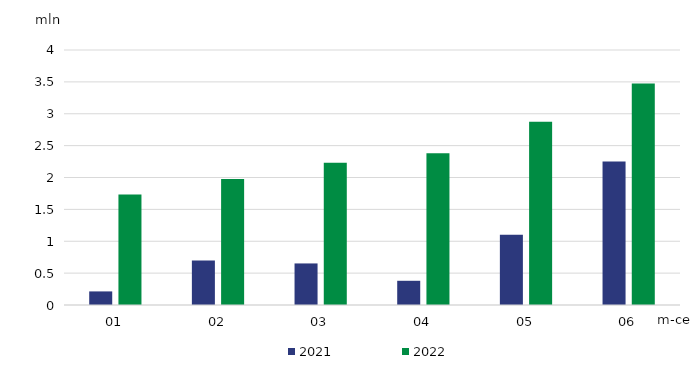
| Category | 2021 | 2022 |
|---|---|---|
| 01 | 0.213 | 1.734 |
| 02 | 0.697 | 1.977 |
| 03 | 0.652 | 2.233 |
| 04 | 0.38 | 2.378 |
| 05 | 1.101 | 2.876 |
| 06 | 2.252 | 3.475 |